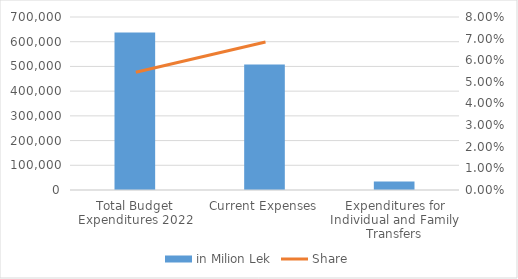
| Category | in Milion Lek |
|---|---|
| Total Budget Expenditures 2022 | 637693.912 |
| Current Expenses | 507348.912 |
| Expenditures for Individual and Family Transfers | 34736.468 |